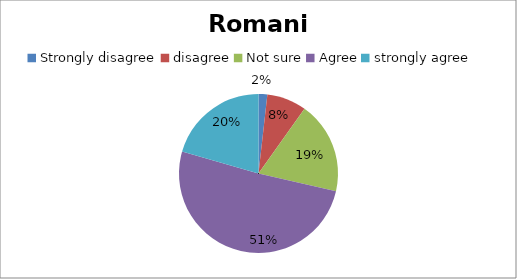
| Category | Series 0 |
|---|---|
| Strongly disagree | 2 |
| disagree | 9 |
| Not sure | 21 |
| Agree | 57 |
| strongly agree | 23 |